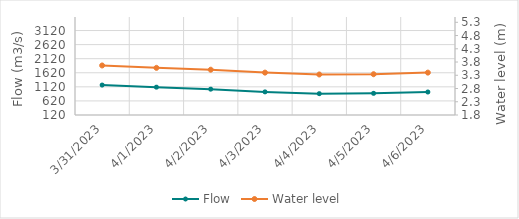
| Category | Flow |
|---|---|
| 4/26/22 | 2851.29 |
| 4/25/22 | 2939.17 |
| 4/24/22 | 3066.67 |
| 4/23/22 | 2890.6 |
| 4/22/22 | 2544.51 |
| 4/21/22 | 2377.31 |
| 4/20/22 | 2346.67 |